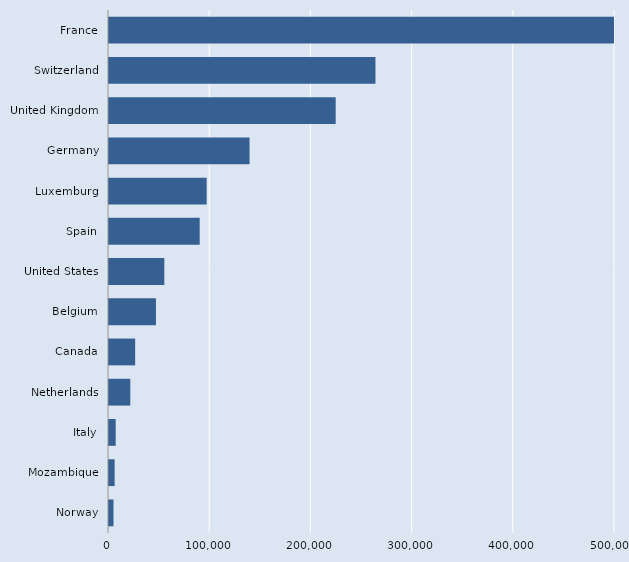
| Category | Series 0 |
|---|---|
| Norway | 4452 |
| Mozambique | 5560 |
| Italy | 6603 |
| Netherlands | 21051 |
| Canada | 25855 |
| Belgium | 46391 |
| United States | 54669 |
| Spain | 89616 |
| Luxemburg | 96500 |
| Germany | 138890 |
| United Kingdom | 224000 |
| Switzerland | 263311 |
| France | 530800 |